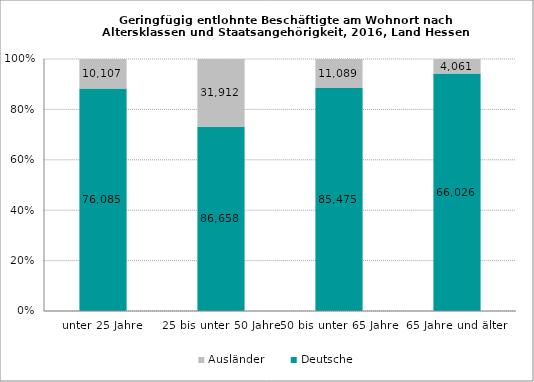
| Category | Deutsche | Ausländer |
|---|---|---|
| unter 25 Jahre | 76085 | 10107 |
| 25 bis unter 50 Jahre | 86658 | 31912 |
| 50 bis unter 65 Jahre | 85475 | 11089 |
| 65 Jahre und älter | 66026 | 4061 |